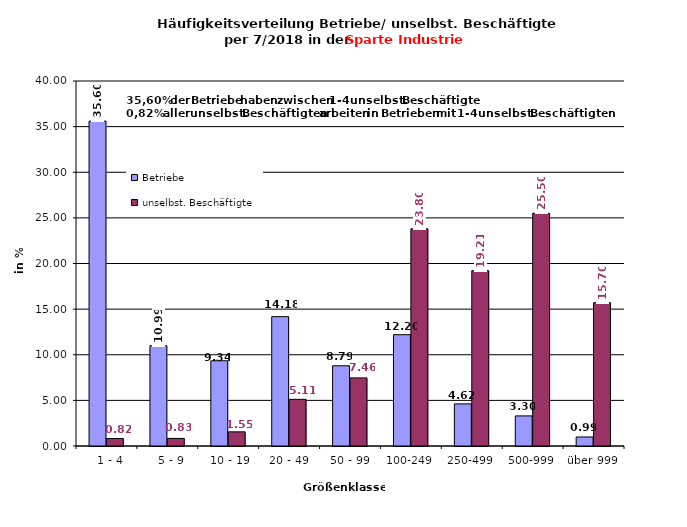
| Category | Betriebe | unselbst. Beschäftigte |
|---|---|---|
|   1 - 4 | 35.604 | 0.822 |
|   5 - 9 | 10.989 | 0.833 |
|  10 - 19 | 9.341 | 1.551 |
| 20 - 49 | 14.176 | 5.114 |
| 50 - 99 | 8.791 | 7.465 |
| 100-249 | 12.198 | 23.798 |
| 250-499 | 4.615 | 19.213 |
| 500-999 | 3.297 | 25.504 |
| über 999 | 0.989 | 15.7 |